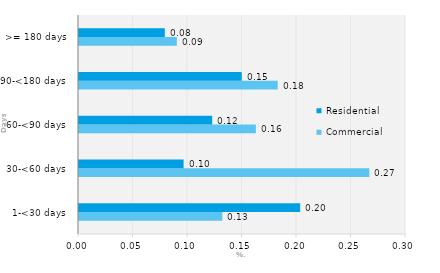
| Category | Commercial | Residential |
|---|---|---|
| 1-<30 days | 0.132 | 0.203 |
| 30-<60 days | 0.266 | 0.096 |
| 60-<90 days | 0.162 | 0.122 |
| 90-<180 days | 0.182 | 0.149 |
| >= 180 days | 0.09 | 0.079 |